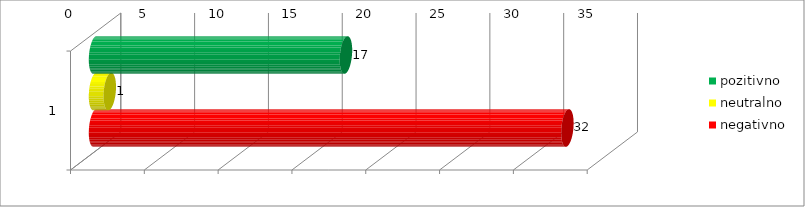
| Category | pozitivno | neutralno | negativno |
|---|---|---|---|
| 0 | 17 | 1 | 32 |